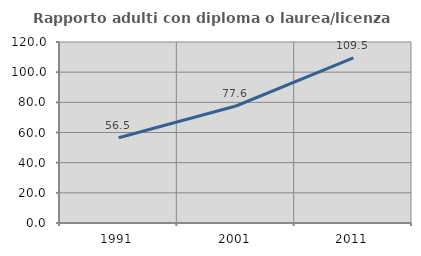
| Category | Rapporto adulti con diploma o laurea/licenza media  |
|---|---|
| 1991.0 | 56.548 |
| 2001.0 | 77.57 |
| 2011.0 | 109.492 |